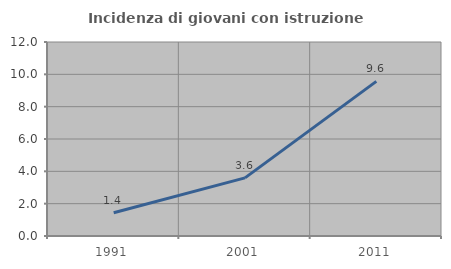
| Category | Incidenza di giovani con istruzione universitaria |
|---|---|
| 1991.0 | 1.439 |
| 2001.0 | 3.597 |
| 2011.0 | 9.565 |